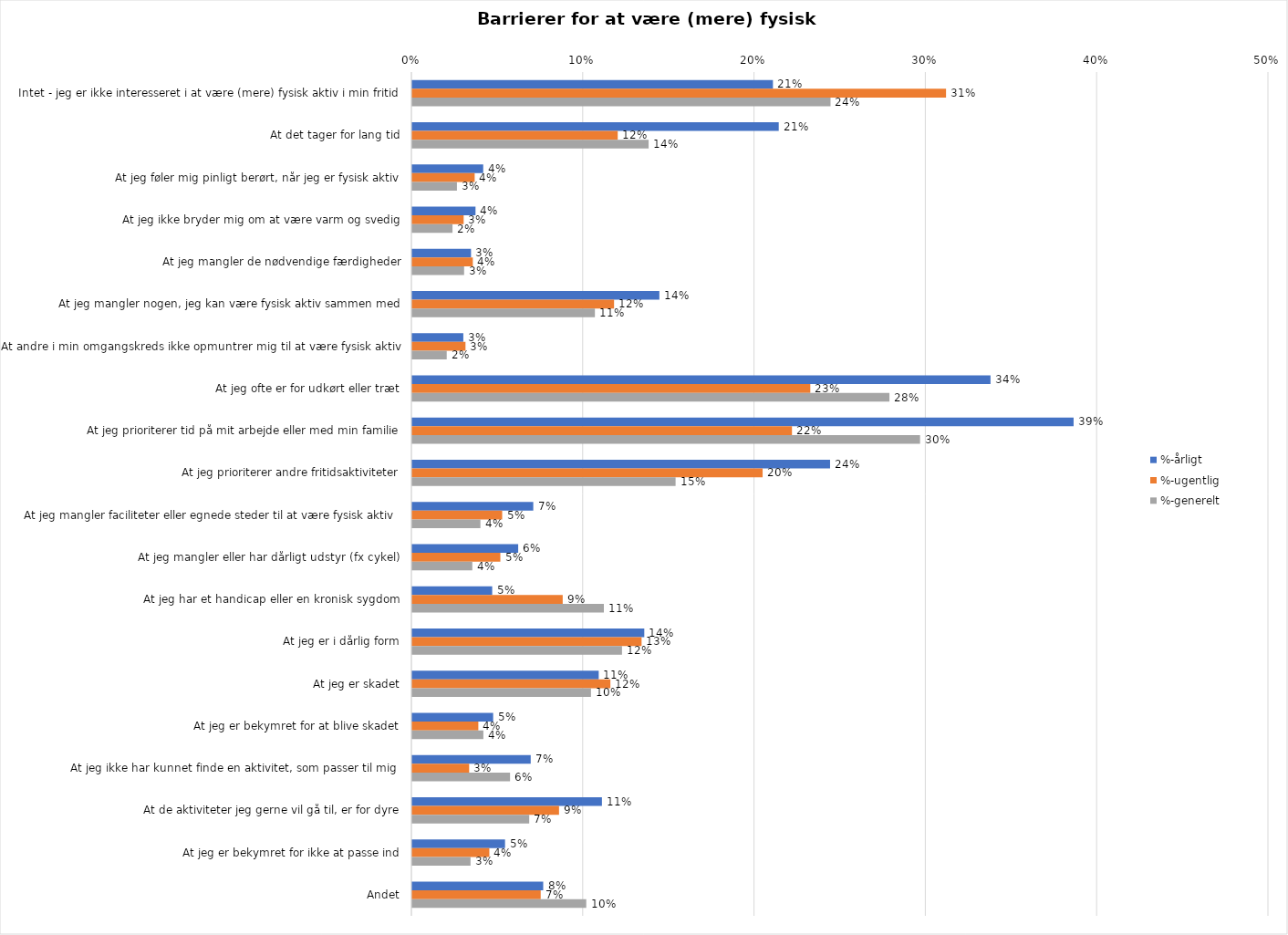
| Category | %-årligt | %-ugentlig | %-generelt |
|---|---|---|---|
| Intet - jeg er ikke interesseret i at være (mere) fysisk aktiv i min fritid | 0.211 | 0.312 | 0.244 |
| At det tager for lang tid | 0.214 | 0.12 | 0.138 |
| At jeg føler mig pinligt berørt, når jeg er fysisk aktiv | 0.041 | 0.036 | 0.026 |
| At jeg ikke bryder mig om at være varm og svedig | 0.037 | 0.03 | 0.023 |
| At jeg mangler de nødvendige færdigheder | 0.034 | 0.035 | 0.03 |
| At jeg mangler nogen, jeg kan være fysisk aktiv sammen med | 0.144 | 0.118 | 0.107 |
| At andre i min omgangskreds ikke opmuntrer mig til at være fysisk aktiv | 0.03 | 0.031 | 0.02 |
| At jeg ofte er for udkørt eller træt | 0.338 | 0.232 | 0.279 |
| At jeg prioriterer tid på mit arbejde eller med min familie | 0.386 | 0.222 | 0.296 |
| At jeg prioriterer andre fritidsaktiviteter | 0.244 | 0.204 | 0.154 |
| At jeg mangler faciliteter eller egnede steder til at være fysisk aktiv  | 0.071 | 0.052 | 0.04 |
| At jeg mangler eller har dårligt udstyr (fx cykel) | 0.062 | 0.051 | 0.035 |
| At jeg har et handicap eller en kronisk sygdom | 0.047 | 0.088 | 0.112 |
| At jeg er i dårlig form | 0.135 | 0.134 | 0.122 |
| At jeg er skadet | 0.109 | 0.116 | 0.104 |
| At jeg er bekymret for at blive skadet | 0.047 | 0.039 | 0.041 |
| At jeg ikke har kunnet finde en aktivitet, som passer til mig  | 0.069 | 0.033 | 0.057 |
| At de aktiviteter jeg gerne vil gå til, er for dyre | 0.111 | 0.086 | 0.068 |
| At jeg er bekymret for ikke at passe ind | 0.054 | 0.045 | 0.034 |
| Andet | 0.076 | 0.075 | 0.102 |